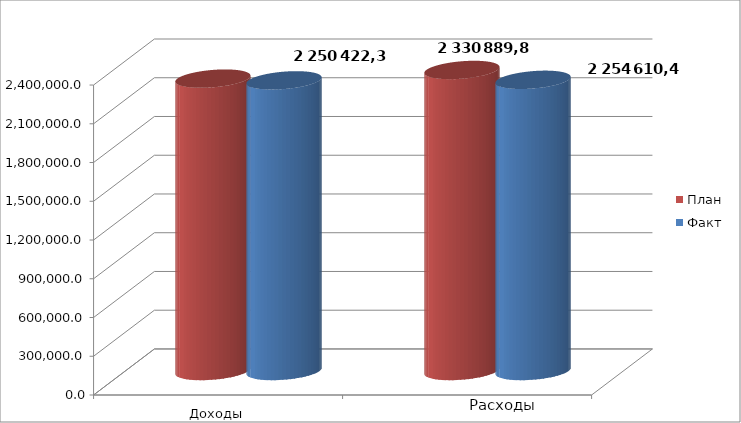
| Category | План | Факт |
|---|---|---|
| 0 | 2263910.2 | 2250422.3 |
| 1 | 2330889.8 | 2254610.4 |